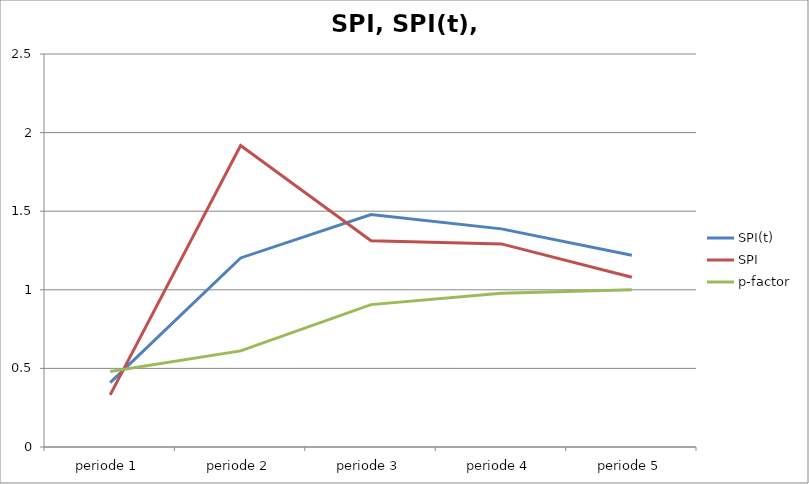
| Category | SPI(t) | SPI | p-factor |
|---|---|---|---|
| periode 1 | 0.409 | 0.331 | 0.48 |
| periode 2 | 1.203 | 1.918 | 0.612 |
| periode 3 | 1.479 | 1.313 | 0.906 |
| periode 4 | 1.388 | 1.292 | 0.978 |
| periode 5 | 1.22 | 1.08 | 1 |